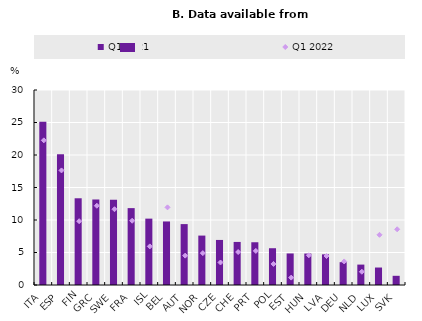
| Category | Q1 2021 |
|---|---|
| ITA | 25.099 |
| ESP | 20.109 |
| FIN | 13.343 |
| GRC | 13.157 |
| SWE | 13.119 |
| FRA | 11.827 |
| ISL | 10.21 |
| BEL | 9.774 |
| AUT | 9.37 |
| NOR | 7.603 |
| CZE | 6.932 |
| CHE | 6.626 |
| PRT | 6.577 |
| POL | 5.658 |
| EST | 4.854 |
| HUN | 4.838 |
| LVA | 4.714 |
| DEU | 3.511 |
| NLD | 3.139 |
| LUX | 2.689 |
| SVK | 1.414 |